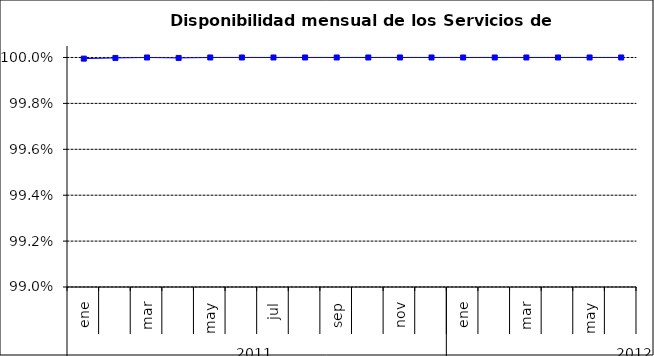
| Category | SCL |
|---|---|
| 0 | 1 |
| 1 | 1 |
| 2 | 1 |
| 3 | 1 |
| 4 | 1 |
| 5 | 1 |
| 6 | 1 |
| 7 | 1 |
| 8 | 1 |
| 9 | 1 |
| 10 | 1 |
| 11 | 1 |
| 12 | 1 |
| 13 | 1 |
| 14 | 1 |
| 15 | 1 |
| 16 | 1 |
| 17 | 1 |